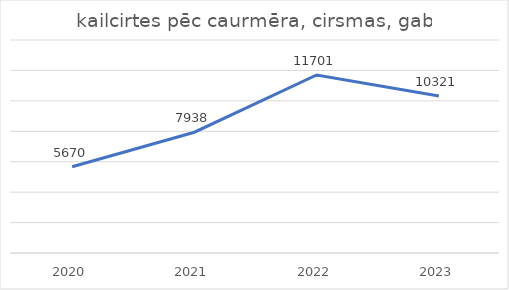
| Category | kailcirtes pēc caurmēra, cirsmas, gab |
|---|---|
| 2020.0 | 5670 |
| 2021.0 | 7938 |
| 2022.0 | 11701 |
| 2023.0 | 10321 |